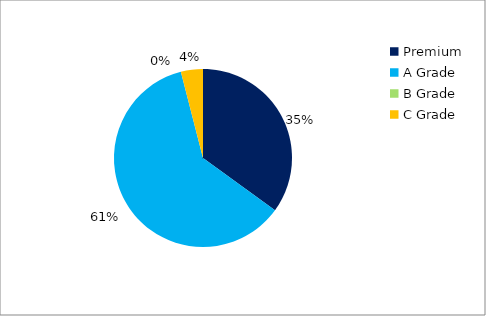
| Category | Series 0 |
|---|---|
| Premium | 0.35 |
| A Grade | 0.61 |
| B Grade | 0 |
| C Grade | 0.04 |